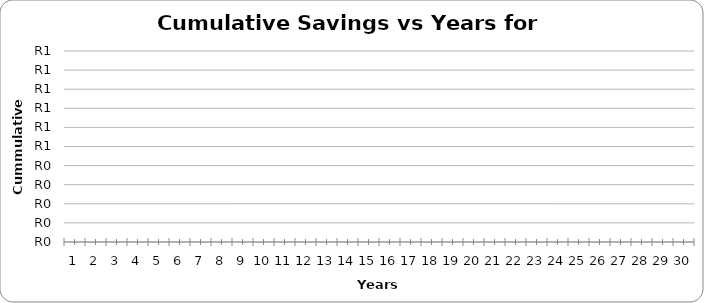
| Category | Cumulative Savings |
|---|---|
| 1.0 | 0 |
| 2.0 | 0 |
| 3.0 | 0 |
| 4.0 | 0 |
| 5.0 | 0 |
| 6.0 | 0 |
| 7.0 | 0 |
| 8.0 | 0 |
| 9.0 | 0 |
| 10.0 | 0 |
| 11.0 | 0 |
| 12.0 | 0 |
| 13.0 | 0 |
| 14.0 | 0 |
| 15.0 | 0 |
| 16.0 | 0 |
| 17.0 | 0 |
| 18.0 | 0 |
| 19.0 | 0 |
| 20.0 | 0 |
| 21.0 | 0 |
| 22.0 | 0 |
| 23.0 | 0 |
| 24.0 | 0 |
| 25.0 | 0 |
| 26.0 | 0 |
| 27.0 | 0 |
| 28.0 | 0 |
| 29.0 | 0 |
| 30.0 | 0 |